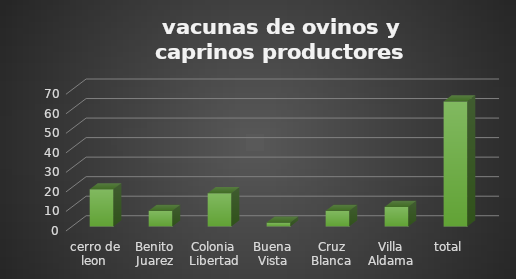
| Category | vacunas de ovinos y caprinos |
|---|---|
| cerro de leon  | 19 |
| Benito Juarez | 8 |
| Colonia Libertad | 17 |
| Buena Vista | 2 |
| Cruz Blanca | 8 |
| Villa Aldama | 10 |
| total | 64 |